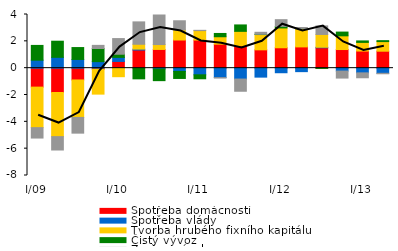
| Category | Spotřeba domácností | Spotřeba vlády | Tvorba hrubého fixního kapitálu | Čistý vývoz | Změna zásob |
|---|---|---|---|---|---|
| I/09 | -1.413 | 0.594 | -3.02 | 1.102 | -0.776 |
| II | -1.814 | 0.808 | -3.289 | 1.201 | -0.997 |
| III | -0.879 | 0.65 | -2.791 | 0.886 | -1.173 |
| IV | -0.084 | 0.486 | -1.85 | 0.98 | 0.233 |
| I/10 | 0.5 | 0.305 | -0.636 | 0.234 | 1.168 |
| II | 1.35 | 0.071 | 0.361 | -0.795 | 1.668 |
| III | 1.396 | -0.066 | 0.364 | -0.864 | 2.204 |
| IV | 2.098 | -0.243 | 0.75 | -0.524 | 0.685 |
| I/11 | 2.096 | -0.495 | 0.704 | -0.295 | 0.021 |
| II | 1.789 | -0.704 | 0.554 | 0.244 | -0.028 |
| III | 1.673 | -0.811 | 1.071 | 0.478 | -0.91 |
| IV | 1.366 | -0.668 | 1.14 | 0.019 | 0.149 |
| I/12 | 1.521 | -0.34 | 1.478 | 0.117 | 0.499 |
| II | 1.585 | -0.259 | 1.356 | 0.02 | 0.073 |
| III | 1.521 | 0.037 | 0.954 | -0.017 | 0.637 |
| IV | 1.389 | -0.216 | 1.022 | 0.279 | -0.522 |
| I/13 | 1.276 | -0.35 | 0.645 | 0.111 | -0.365 |
| II | 1.265 | -0.382 | 0.716 | 0.07 | -0.035 |